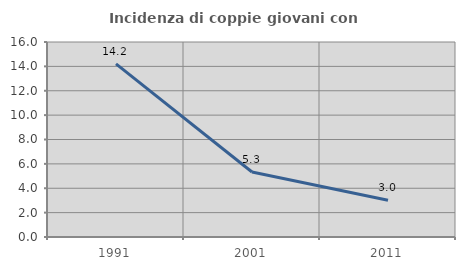
| Category | Incidenza di coppie giovani con figli |
|---|---|
| 1991.0 | 14.205 |
| 2001.0 | 5.333 |
| 2011.0 | 3.015 |